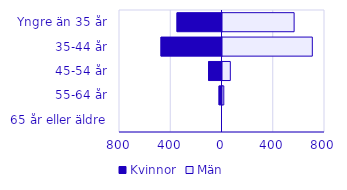
| Category | Kvinnor | Män |
|---|---|---|
| 0 | -351 | 559 |
| 1 | -476 | 701 |
| 2 | -105 | 61 |
| 3 | -23 | 10 |
| 4 | 0 | 0 |